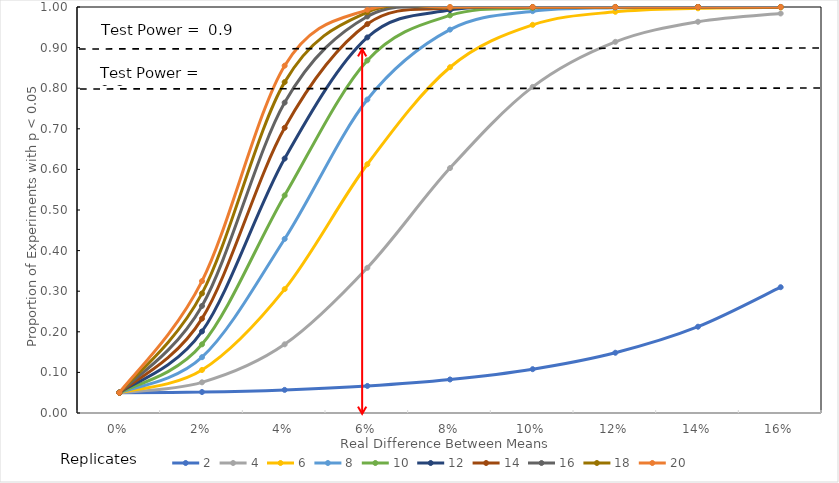
| Category | 2 | 4 | 6 | 8 | 10 | 12 | 14 | 16 | 18 | 20 |
|---|---|---|---|---|---|---|---|---|---|---|
| 0.0 | 0.05 | 0.05 | 0.05 | 0.05 | 0.05 | 0.05 | 0.05 | 0.05 | 0.05 | 0.05 |
| 0.02 | 0.052 | 0.076 | 0.106 | 0.137 | 0.169 | 0.201 | 0.232 | 0.264 | 0.295 | 0.325 |
| 0.04 | 0.057 | 0.169 | 0.305 | 0.429 | 0.536 | 0.627 | 0.702 | 0.765 | 0.815 | 0.855 |
| 0.06 | 0.067 | 0.358 | 0.613 | 0.772 | 0.868 | 0.925 | 0.958 | 0.977 | 0.987 | 0.993 |
| 0.08 | 0.083 | 0.603 | 0.852 | 0.944 | 0.979 | 0.992 | 0.997 | 0.999 | 1 | 1 |
| 0.1 | 0.108 | 0.803 | 0.956 | 0.99 | 0.998 | 0.999 | 1 | 1 | 1 | 1 |
| 0.12 | 0.148 | 0.914 | 0.988 | 0.998 | 1 | 1 | 1 | 1 | 1 | 1 |
| 0.14 | 0.213 | 0.964 | 0.997 | 1 | 1 | 1 | 1 | 1 | 1 | 1 |
| 0.16 | 0.31 | 0.984 | 0.999 | 1 | 1 | 1 | 1 | 1 | 1 | 1 |